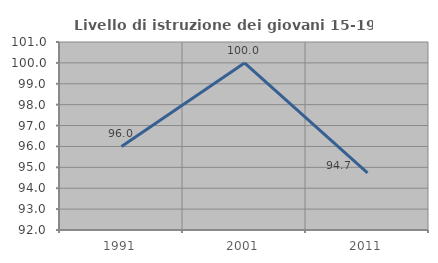
| Category | Livello di istruzione dei giovani 15-19 anni |
|---|---|
| 1991.0 | 96 |
| 2001.0 | 100 |
| 2011.0 | 94.737 |